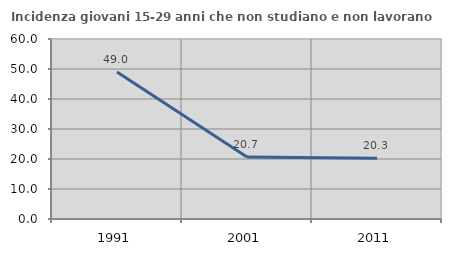
| Category | Incidenza giovani 15-29 anni che non studiano e non lavorano  |
|---|---|
| 1991.0 | 49.026 |
| 2001.0 | 20.663 |
| 2011.0 | 20.254 |